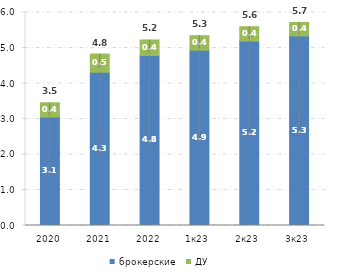
| Category | брокерские | ДУ |
|---|---|---|
| 2020 | 3.055 | 0.402 |
| 2021 | 4.316 | 0.513 |
| 2022 | 4.789 | 0.437 |
| 1к23 | 4.938 | 0.41 |
| 2к23 | 5.194 | 0.406 |
| 3к23 | 5.34 | 0.378 |